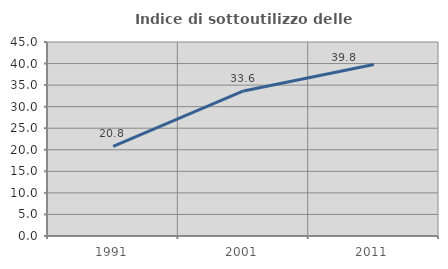
| Category | Indice di sottoutilizzo delle abitazioni  |
|---|---|
| 1991.0 | 20.789 |
| 2001.0 | 33.645 |
| 2011.0 | 39.787 |